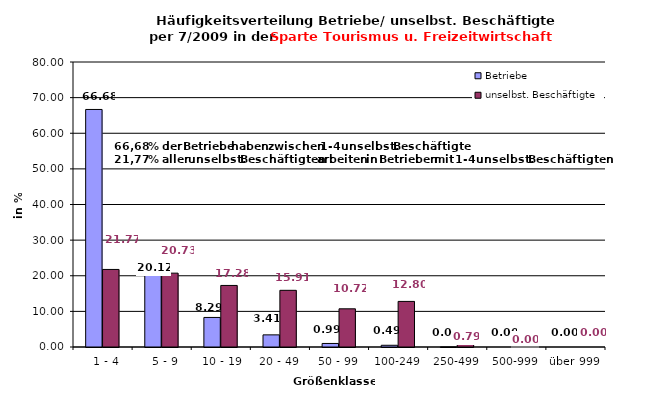
| Category | Betriebe | unselbst. Beschäftigte |
|---|---|---|
|   1 - 4 | 66.679 | 21.77 |
|   5 - 9 | 20.123 | 20.732 |
|  10 - 19 | 8.294 | 17.278 |
| 20 - 49 | 3.408 | 15.908 |
| 50 - 99 | 0.992 | 10.722 |
| 100-249 | 0.487 | 12.798 |
| 250-499 | 0.018 | 0.793 |
| 500-999 | 0 | 0 |
| über 999 | 0 | 0 |